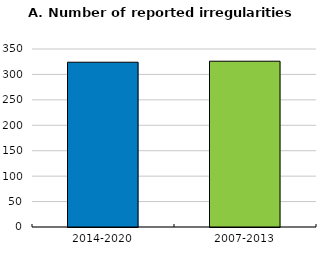
| Category | Series 0 |
|---|---|
| 2014-2020 | 324 |
| 2007-2013 | 326 |